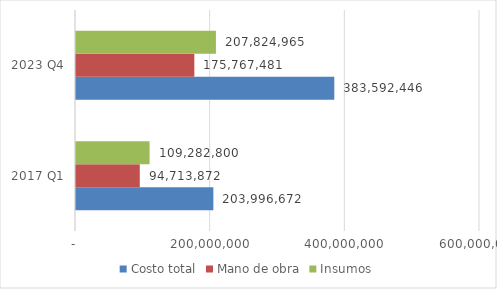
| Category | Costo total | Mano de obra | Insumos |
|---|---|---|---|
| 2017 Q1 | 203996672 | 94713872 | 109282800 |
| 2023 Q4 | 383592446.029 | 175767481 | 207824965.029 |